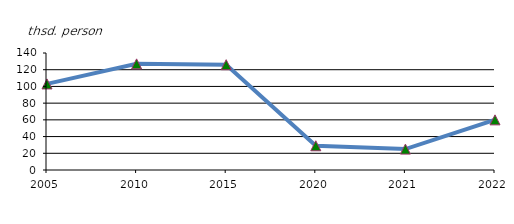
| Category | Sirkə gələnlərin sayı |
|---|---|
| 2005.0 | 103 |
| 2010.0 | 127 |
| 2015.0 | 126 |
| 2020.0 | 29 |
| 2021.0 | 25 |
| 2022.0 | 60 |